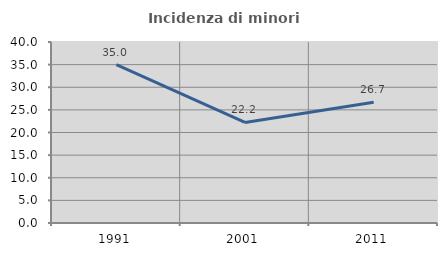
| Category | Incidenza di minori stranieri |
|---|---|
| 1991.0 | 35 |
| 2001.0 | 22.222 |
| 2011.0 | 26.703 |